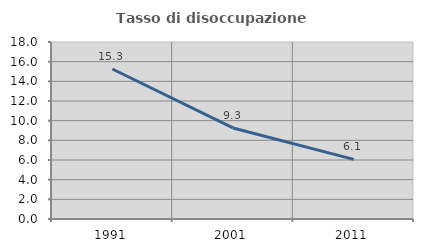
| Category | Tasso di disoccupazione giovanile  |
|---|---|
| 1991.0 | 15.254 |
| 2001.0 | 9.259 |
| 2011.0 | 6.061 |